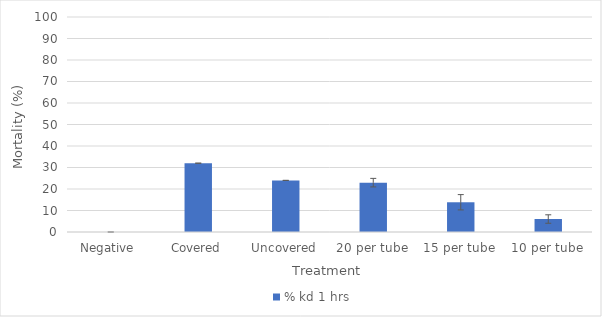
| Category | % kd 1 hrs |
|---|---|
| Negative  | 0 |
| Covered | 32 |
| Uncovered | 24 |
| 20 per tube | 22.951 |
| 15 per tube | 13.83 |
| 10 per tube | 6.034 |